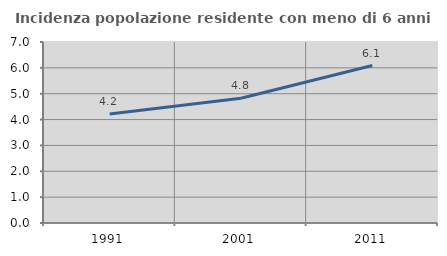
| Category | Incidenza popolazione residente con meno di 6 anni |
|---|---|
| 1991.0 | 4.213 |
| 2001.0 | 4.822 |
| 2011.0 | 6.089 |